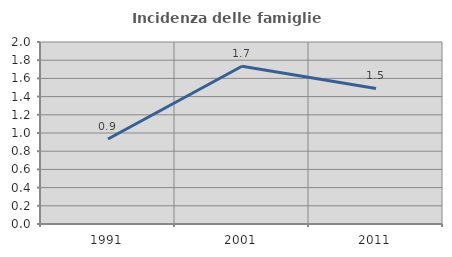
| Category | Incidenza delle famiglie numerose |
|---|---|
| 1991.0 | 0.935 |
| 2001.0 | 1.734 |
| 2011.0 | 1.49 |